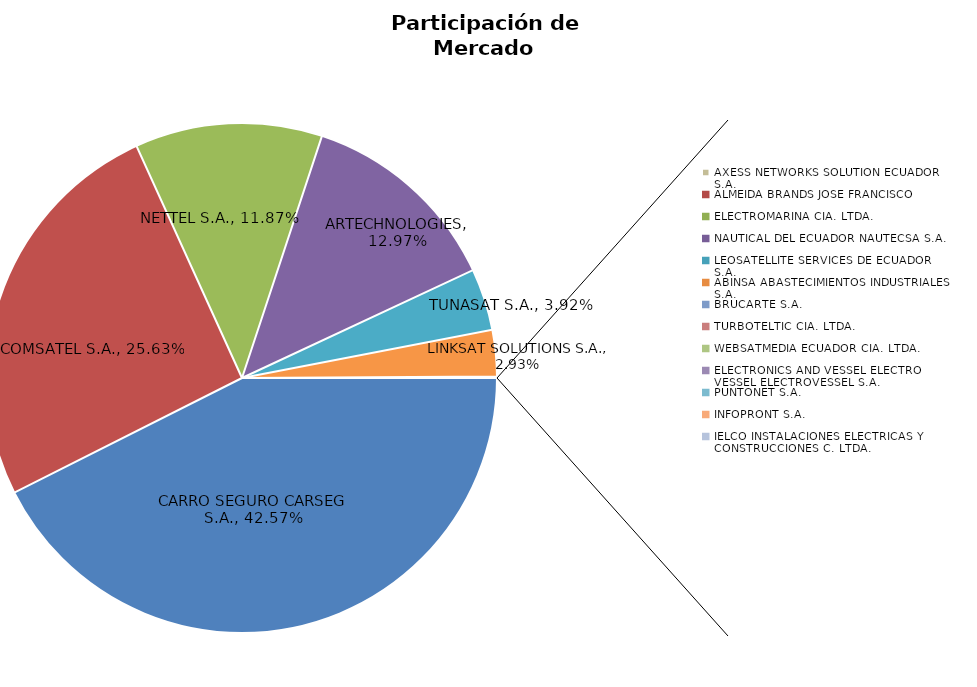
| Category | Series 0 |
|---|---|
| CARRO SEGURO CARSEG S.A. | 0.426 |
| COMSATEL S.A. | 0.256 |
| NETTEL S.A. | 0.119 |
| ARTECHNOLOGIES | 0.13 |
| TUNASAT S.A. | 0.039 |
| LINKSAT SOLUTIONS S.A. | 0.029 |
| AXESS NETWORKS SOLUTION ECUADOR S.A. | 0.001 |
| ALMEIDA BRANDS JOSE FRANCISCO | 0 |
| ELECTROMARINA CIA. LTDA. | 0 |
| NAUTICAL DEL ECUADOR NAUTECSA S.A. | 0 |
| LEOSATELLITE SERVICES DE ECUADOR S.A. | 0 |
| ABINSA ABASTECIMIENTOS INDUSTRIALES S.A. | 0 |
| BRUCARTE S.A. | 0 |
| TURBOTELTIC CIA. LTDA. | 0 |
| WEBSATMEDIA ECUADOR CIA. LTDA. | 0 |
| ELECTRONICS AND VESSEL ELECTRO VESSEL ELECTROVESSEL S.A. | 0 |
| PUNTONET S.A. | 0 |
| INFOPRONT S.A. | 0 |
| IELCO INSTALACIONES ELECTRICAS Y CONSTRUCCIONES C. LTDA. | 0 |